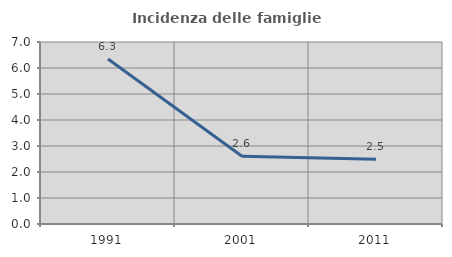
| Category | Incidenza delle famiglie numerose |
|---|---|
| 1991.0 | 6.349 |
| 2001.0 | 2.605 |
| 2011.0 | 2.487 |